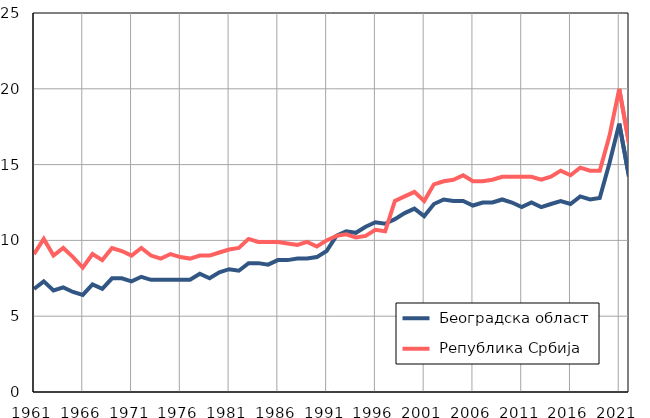
| Category |  Београдска област |  Република Србија |
|---|---|---|
| 1961.0 | 6.8 | 9.1 |
| 1962.0 | 7.3 | 10.1 |
| 1963.0 | 6.7 | 9 |
| 1964.0 | 6.9 | 9.5 |
| 1965.0 | 6.6 | 8.9 |
| 1966.0 | 6.4 | 8.2 |
| 1967.0 | 7.1 | 9.1 |
| 1968.0 | 6.8 | 8.7 |
| 1969.0 | 7.5 | 9.5 |
| 1970.0 | 7.5 | 9.3 |
| 1971.0 | 7.3 | 9 |
| 1972.0 | 7.6 | 9.5 |
| 1973.0 | 7.4 | 9 |
| 1974.0 | 7.4 | 8.8 |
| 1975.0 | 7.4 | 9.1 |
| 1976.0 | 7.4 | 8.9 |
| 1977.0 | 7.4 | 8.8 |
| 1978.0 | 7.8 | 9 |
| 1979.0 | 7.5 | 9 |
| 1980.0 | 7.9 | 9.2 |
| 1981.0 | 8.1 | 9.4 |
| 1982.0 | 8 | 9.5 |
| 1983.0 | 8.5 | 10.1 |
| 1984.0 | 8.5 | 9.9 |
| 1985.0 | 8.4 | 9.9 |
| 1986.0 | 8.7 | 9.9 |
| 1987.0 | 8.7 | 9.8 |
| 1988.0 | 8.8 | 9.7 |
| 1989.0 | 8.8 | 9.9 |
| 1990.0 | 8.9 | 9.6 |
| 1991.0 | 9.3 | 10 |
| 1992.0 | 10.3 | 10.3 |
| 1993.0 | 10.6 | 10.4 |
| 1994.0 | 10.5 | 10.2 |
| 1995.0 | 10.9 | 10.3 |
| 1996.0 | 11.2 | 10.7 |
| 1997.0 | 11.1 | 10.6 |
| 1998.0 | 11.4 | 12.6 |
| 1999.0 | 11.8 | 12.9 |
| 2000.0 | 12.1 | 13.2 |
| 2001.0 | 11.6 | 12.6 |
| 2002.0 | 12.4 | 13.7 |
| 2003.0 | 12.7 | 13.9 |
| 2004.0 | 12.6 | 14 |
| 2005.0 | 12.6 | 14.3 |
| 2006.0 | 12.3 | 13.9 |
| 2007.0 | 12.5 | 13.9 |
| 2008.0 | 12.5 | 14 |
| 2009.0 | 12.7 | 14.2 |
| 2010.0 | 12.5 | 14.2 |
| 2011.0 | 12.2 | 14.2 |
| 2012.0 | 12.5 | 14.2 |
| 2013.0 | 12.2 | 14 |
| 2014.0 | 12.4 | 14.2 |
| 2015.0 | 12.6 | 14.6 |
| 2016.0 | 12.4 | 14.3 |
| 2017.0 | 12.9 | 14.8 |
| 2018.0 | 12.7 | 14.6 |
| 2019.0 | 12.8 | 14.6 |
| 2020.0 | 15.1 | 16.9 |
| 2021.0 | 17.7 | 20 |
| 2022.0 | 14.2 | 16.4 |